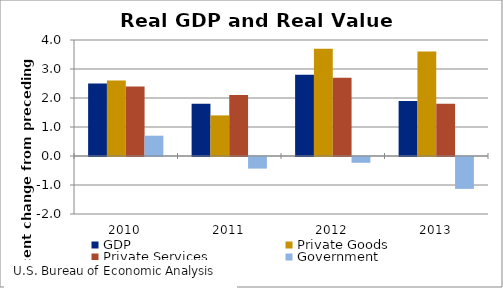
| Category | GDP | Private Goods | Private Services | Government |
|---|---|---|---|---|
| 2010.0 | 2.5 | 2.6 | 2.4 | 0.7 |
| 2011.0 | 1.8 | 1.4 | 2.1 | -0.4 |
| 2012.0 | 2.8 | 3.7 | 2.7 | -0.2 |
| 2013.0 | 1.9 | 3.6 | 1.8 | -1.1 |